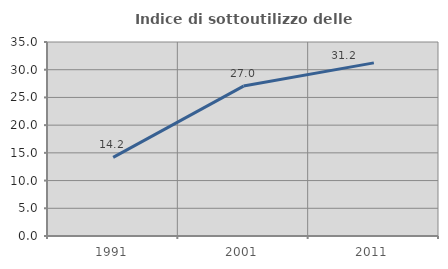
| Category | Indice di sottoutilizzo delle abitazioni  |
|---|---|
| 1991.0 | 14.194 |
| 2001.0 | 27.049 |
| 2011.0 | 31.236 |